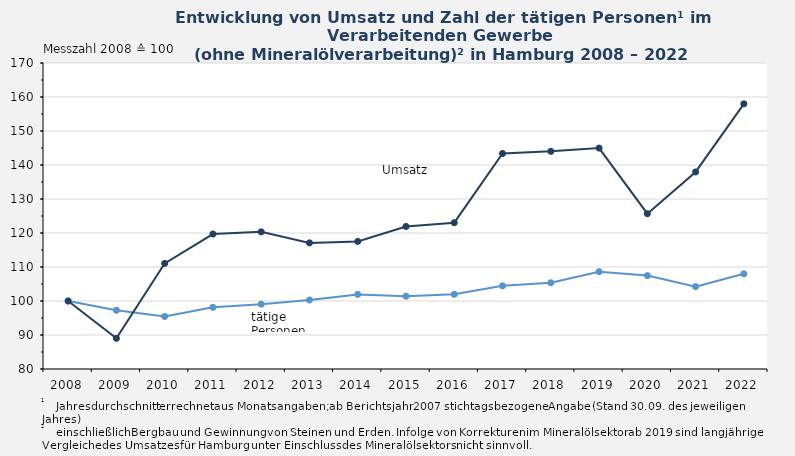
| Category | Tätige Personen1 | Umsatz in 1000 Euro |
|---|---|---|
| 2008.0 | 100 | 100 |
| 2009.0 | 97.265 | 89.021 |
| 2010.0 | 95.447 | 111.053 |
| 2011.0 | 98.132 | 119.695 |
| 2012.0 | 99.072 | 120.348 |
| 2013.0 | 100.289 | 117.095 |
| 2014.0 | 101.934 | 117.523 |
| 2015.0 | 101.399 | 121.925 |
| 2016.0 | 101.964 | 123.035 |
| 2017.0 | 104.461 | 143.381 |
| 2018.0 | 105.354 | 144.013 |
| 2019.0 | 108.628 | 144.978 |
| 2020.0 | 107.476 | 125.683 |
| 2021.0 | 104.233 | 137.955 |
| 2022.0 | 108 | 158 |